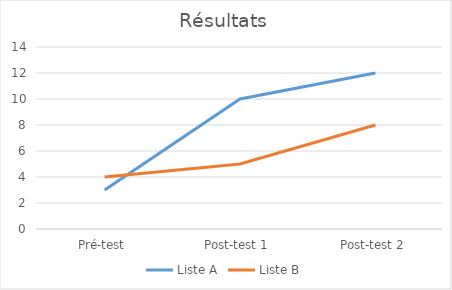
| Category | Liste A | Liste B |
|---|---|---|
| Pré-test | 3 | 4 |
| Post-test 1 | 10 | 5 |
| Post-test 2 | 12 | 8 |